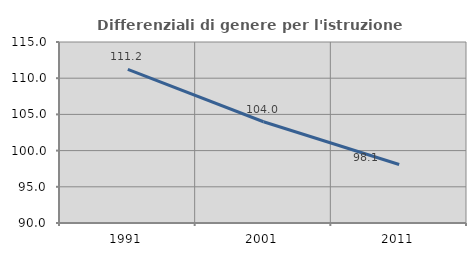
| Category | Differenziali di genere per l'istruzione superiore |
|---|---|
| 1991.0 | 111.227 |
| 2001.0 | 103.984 |
| 2011.0 | 98.074 |